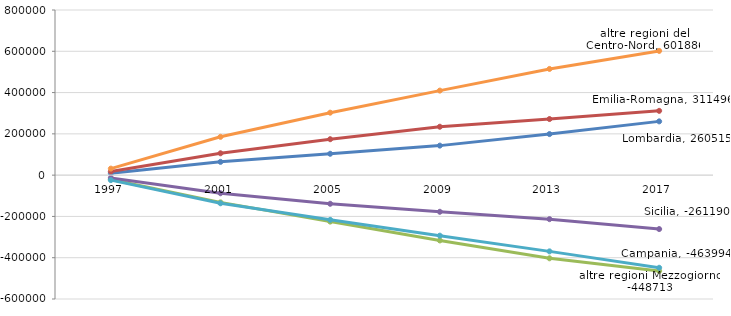
| Category | Lombardia | Emilia-Romagna | Campania | Sicilia | altre regioni Mezzogiorno | altre regioni del Centro-Nord |
|---|---|---|---|---|---|---|
| 1997.0 | 9257 | 17377 | -20843 | -13320 | -24030 | 31559 |
| 2001.0 | 64361 | 105837 | -131879 | -87718 | -136248 | 185647 |
| 2005.0 | 103535 | 174096 | -225036 | -138715 | -216465 | 302585 |
| 2009.0 | 143016 | 234498 | -316345 | -177503 | -293212 | 409546 |
| 2013.0 | 198914 | 271750 | -402793 | -213186 | -369238 | 514553 |
| 2017.0 | 260515 | 311496 | -463994 | -261190 | -448713 | 601886 |